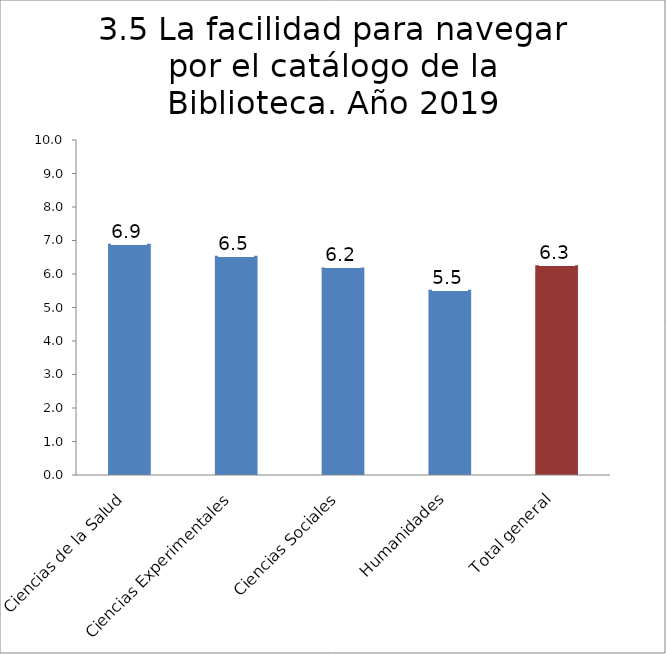
| Category | Series 0 |
|---|---|
| Ciencias de la Salud | 6.905 |
| Ciencias Experimentales | 6.541 |
| Ciencias Sociales | 6.196 |
| Humanidades | 5.53 |
| Total general | 6.259 |